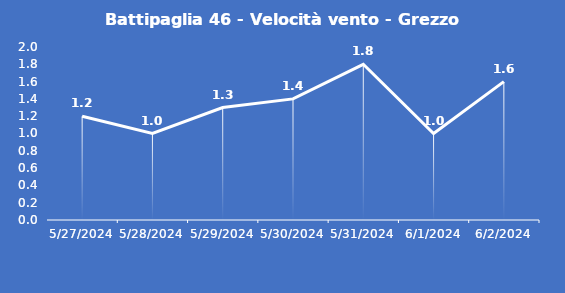
| Category | Battipaglia 46 - Velocità vento - Grezzo (m/s) |
|---|---|
| 5/27/24 | 1.2 |
| 5/28/24 | 1 |
| 5/29/24 | 1.3 |
| 5/30/24 | 1.4 |
| 5/31/24 | 1.8 |
| 6/1/24 | 1 |
| 6/2/24 | 1.6 |